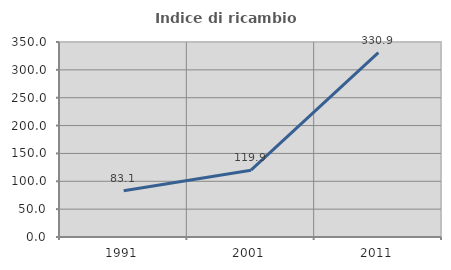
| Category | Indice di ricambio occupazionale  |
|---|---|
| 1991.0 | 83.062 |
| 2001.0 | 119.914 |
| 2011.0 | 330.851 |